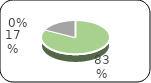
| Category | Series 0 |
|---|---|
| 0 | 159673.29 |
| 1 | 0 |
| 2 | 33818.71 |